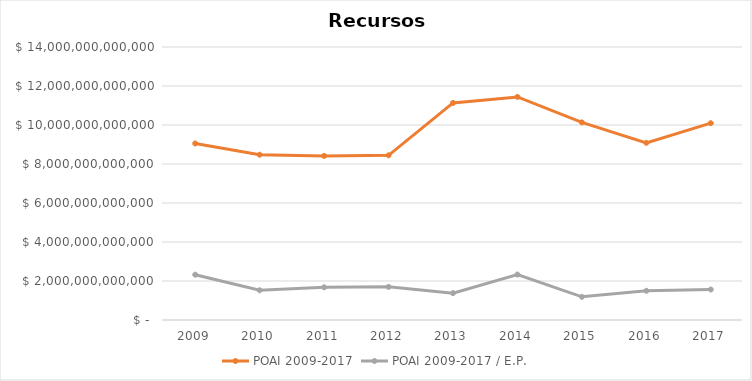
| Category | POAI 2009-2017 | POAI 2009-2017 / E.P. |
|---|---|---|
| 2009.0 | 9052675714525.805 | 2322416505613.082 |
| 2010.0 | 8476348874363.346 | 1525806949068.572 |
| 2011.0 | 8416284981568.416 | 1678083298670.73 |
| 2012.0 | 8446407787683.39 | 1699380197884.864 |
| 2013.0 | 11131508007152.88 | 1378546511027.831 |
| 2014.0 | 11439764277656.838 | 2332759817176.808 |
| 2015.0 | 10132310163573.809 | 1187758602673.829 |
| 2016.0 | 9086626372536.072 | 1497339427408.415 |
| 2017.0 | 10094361014000 | 1562914246000 |